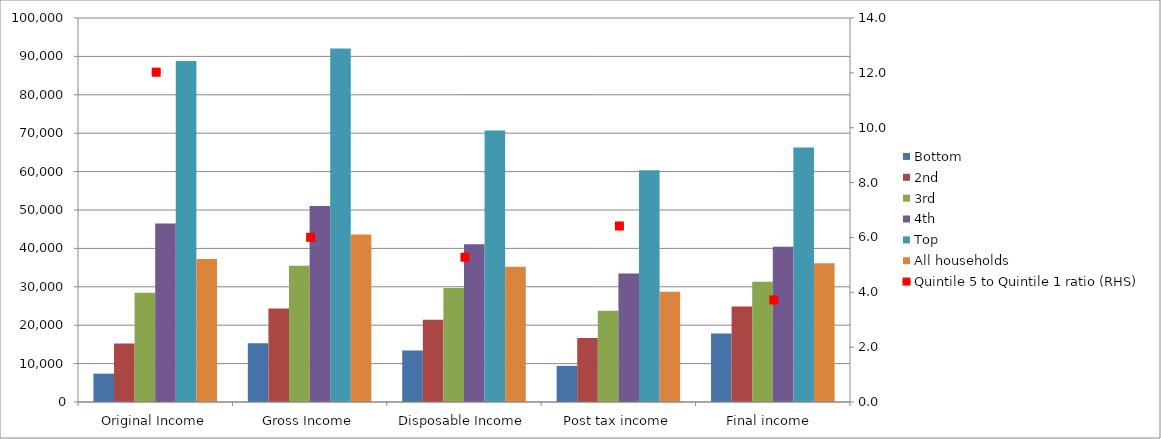
| Category | Bottom | 2nd | 3rd | 4th | Top | All households |
|---|---|---|---|---|---|---|
| Original Income | 7383 | 15245 | 28443 | 46505 | 88776 | 37270 |
| Gross Income | 15331 | 24340 | 35463 | 51047 | 92042 | 43645 |
| Disposable Income | 13392 | 21436 | 29667 | 41058 | 70684 | 35247 |
| Post tax income | 9408 | 16635 | 23736 | 33492 | 60377 | 28730 |
| Final income  | 17817 | 24851 | 31341 | 40407 | 66302 | 36144 |